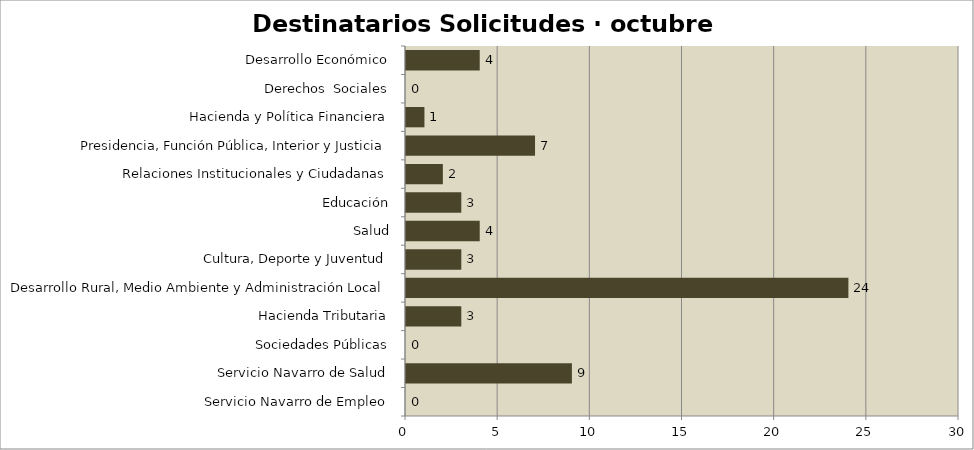
| Category | Series 0 |
|---|---|
| Servicio Navarro de Empleo | 0 |
| Servicio Navarro de Salud | 9 |
| Sociedades Públicas | 0 |
| Hacienda Tributaria | 3 |
| Desarrollo Rural, Medio Ambiente y Administración Local | 24 |
| Cultura, Deporte y Juventud | 3 |
| Salud | 4 |
| Educación | 3 |
| Relaciones Institucionales y Ciudadanas | 2 |
| Presidencia, Función Pública, Interior y Justicia | 7 |
| Hacienda y Política Financiera | 1 |
| Derechos  Sociales | 0 |
| Desarrollo Económico | 4 |